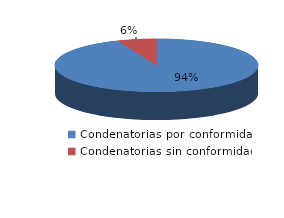
| Category | Series 0 |
|---|---|
| 0 | 866 |
| 1 | 58 |